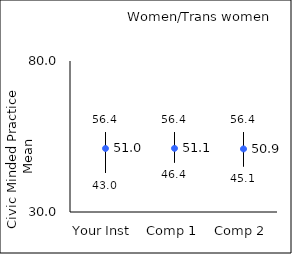
| Category | 25th percentile | 75th percentile | Mean |
|---|---|---|---|
| Your Inst | 43 | 56.4 | 51.04 |
| Comp 1 | 46.4 | 56.4 | 51.08 |
| Comp 2 | 45.1 | 56.4 | 50.89 |